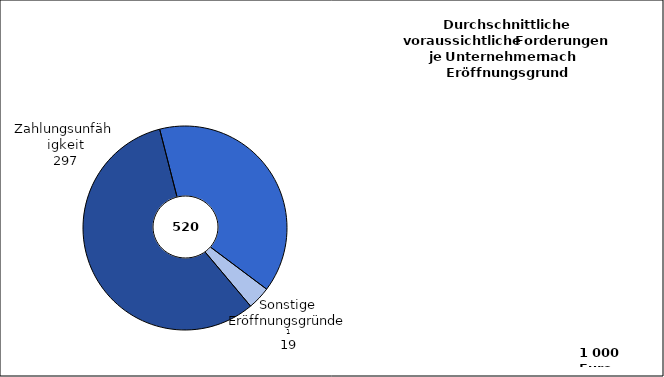
| Category | Series 0 | Series 1 |
|---|---|---|
| Zahlungsunfähigkeit | 297 | 270.461 |
|   Zahlungsunfähigkeit
   und Überschuldung | 204 | 582.529 |
|   Sonstige Eröffnungs-
                      gründe  2 | 19 | 378.368 |